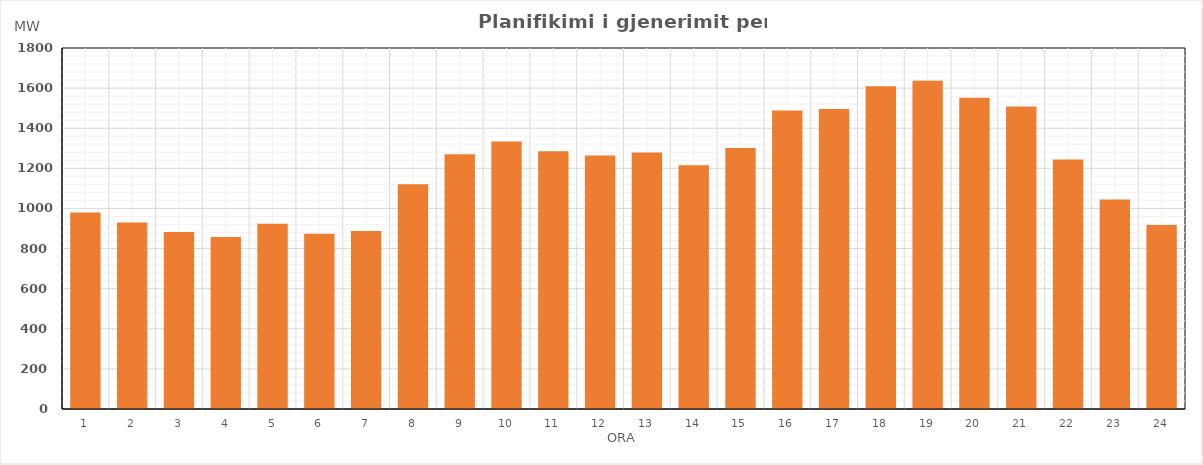
| Category | Max (MW) |
|---|---|
| 0 | 979.41 |
| 1 | 930.51 |
| 2 | 883.02 |
| 3 | 857.42 |
| 4 | 923.7 |
| 5 | 873.51 |
| 6 | 887.92 |
| 7 | 1120.05 |
| 8 | 1269.96 |
| 9 | 1334.18 |
| 10 | 1285.25 |
| 11 | 1264.31 |
| 12 | 1278.97 |
| 13 | 1215.3 |
| 14 | 1301.3 |
| 15 | 1487.92 |
| 16 | 1495.63 |
| 17 | 1608.72 |
| 18 | 1636.43 |
| 19 | 1551.45 |
| 20 | 1508.45 |
| 21 | 1243.94 |
| 22 | 1044.98 |
| 23 | 917.1 |